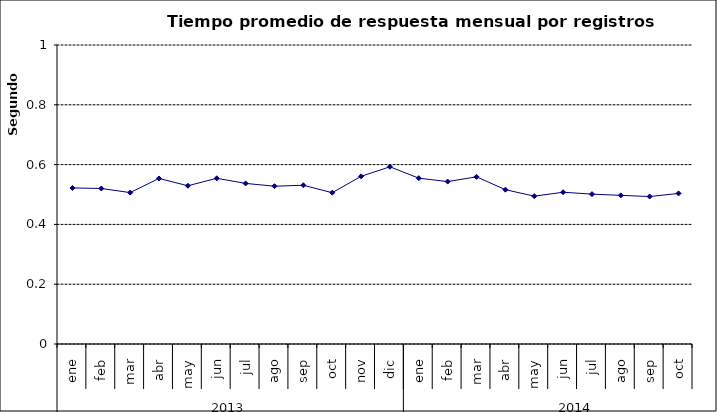
| Category | Tiempo promedio de respuesta por registros cámara PH ** |
|---|---|
| 0 | 0.522 |
| 1 | 0.52 |
| 2 | 0.506 |
| 3 | 0.554 |
| 4 | 0.529 |
| 5 | 0.554 |
| 6 | 0.537 |
| 7 | 0.528 |
| 8 | 0.531 |
| 9 | 0.506 |
| 10 | 0.561 |
| 11 | 0.593 |
| 12 | 0.555 |
| 13 | 0.543 |
| 14 | 0.559 |
| 15 | 0.516 |
| 16 | 0.494 |
| 17 | 0.508 |
| 18 | 0.501 |
| 19 | 0.497 |
| 20 | 0.493 |
| 21 | 0.504 |